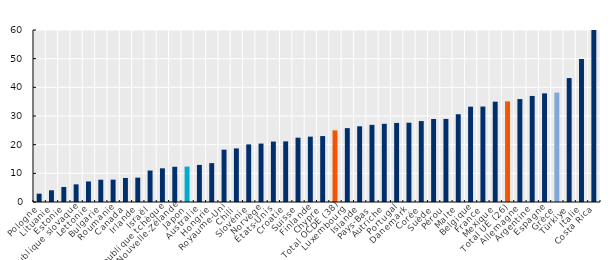
| Category | Series 0 |
|---|---|
| Pologne | 2.901 |
| Lituanie | 4.082 |
| Estonie | 5.246 |
| République slovaque | 6.157 |
| Lettonie | 7.169 |
| Bulgarie | 7.772 |
| Roumanie | 7.793 |
| Canada | 8.388 |
| Irlande | 8.483 |
| Israël | 10.978 |
| République tchèque | 11.753 |
| Nouvelle-Zélande | 12.292 |
| Japon | 12.343 |
| Australie | 12.937 |
| Hongrie | 13.557 |
| Royaume-Uni | 18.258 |
| Chili | 18.7 |
| Slovénie | 20.102 |
| Norvège | 20.38 |
| États-Unis | 21.086 |
| Croatie | 21.146 |
| Suisse | 22.436 |
| Finlande | 22.804 |
| Chypre | 23.001 |
| Total OCDE (38) | 24.994 |
| Luxembourg | 25.775 |
| Islande | 26.414 |
| Pays-Bas | 26.916 |
| Autriche | 27.28 |
| Portugal | 27.583 |
| Danemark | 27.659 |
| Corée | 28.233 |
| Suède | 28.951 |
| Pérou | 28.983 |
| Malte | 30.618 |
| Belgique | 33.258 |
| France | 33.299 |
| Mexique | 35 |
| Total UE (26) | 35.105 |
| Allemagne | 35.908 |
| Argentine | 37 |
| Espagne | 37.896 |
| Grèce | 38.169 |
| Türkiye | 43.237 |
| Italie | 49.895 |
| Costa Rica | 68.7 |